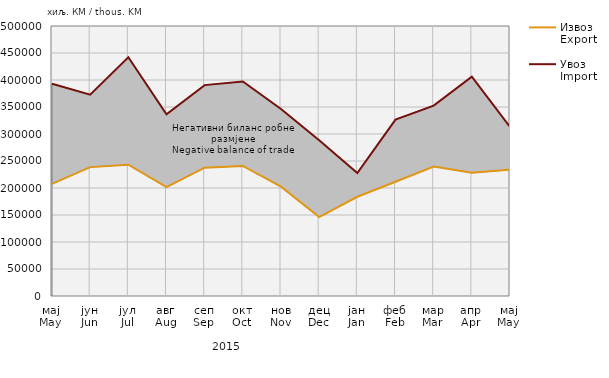
| Category | Извоз
Export | Увоз
Import |
|---|---|---|
| мај
May | 207541 | 393112 |
| јун
Jun | 238678 | 372846 |
| јул
Jul | 243048 | 442035 |
| авг
Aug | 201596 | 336534 |
| сеп
Sep | 237628 | 390519 |
| окт
Oct | 240795 | 397166 |
| нов
Nov | 202399 | 346318 |
| дец
Dec | 146158 | 288270 |
| јан
Jan | 183779 | 227697 |
| феб
Feb | 211524 | 326706 |
| мар
Mar | 239782 | 352510 |
| апр
Apr | 228100 | 406283 |
| мај
May | 233872 | 312920 |